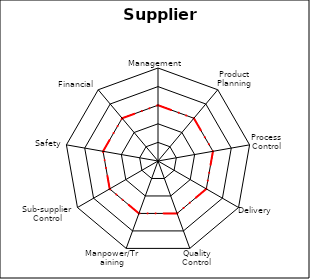
| Category | Series 0 | Series 1 |
|---|---|---|
| 0 | 0 | 3 |
| 1 | 0 | 3 |
| 2 | 0 | 3 |
| 3 | 0 | 3 |
| 4 | 0 | 3 |
| 5 | 0 | 3 |
| 6 | 0 | 3 |
| 7 | 0 | 3 |
| 8 | 0 | 3 |